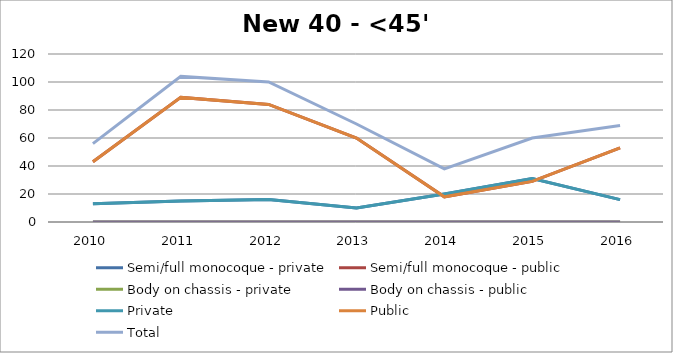
| Category | Semi/full monocoque - private | Semi/full monocoque - public | Body on chassis - private | Body on chassis - public | Private | Public | Total |
|---|---|---|---|---|---|---|---|
| 2010.0 | 13 | 43 | 0 | 0 | 13 | 43 | 56 |
| 2011.0 | 15 | 89 | 0 | 0 | 15 | 89 | 104 |
| 2012.0 | 16 | 84 | 0 | 0 | 16 | 84 | 100 |
| 2013.0 | 10 | 60 | 0 | 0 | 10 | 60 | 70 |
| 2014.0 | 20 | 18 | 0 | 0 | 20 | 18 | 38 |
| 2015.0 | 31 | 29 | 0 | 0 | 31 | 29 | 60 |
| 2016.0 | 16 | 53 | 0 | 0 | 16 | 53 | 69 |